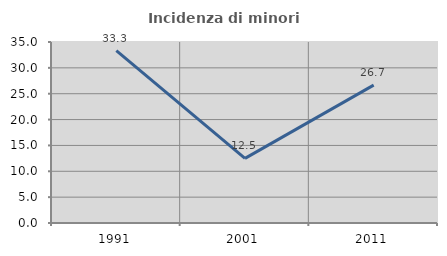
| Category | Incidenza di minori stranieri |
|---|---|
| 1991.0 | 33.333 |
| 2001.0 | 12.5 |
| 2011.0 | 26.667 |